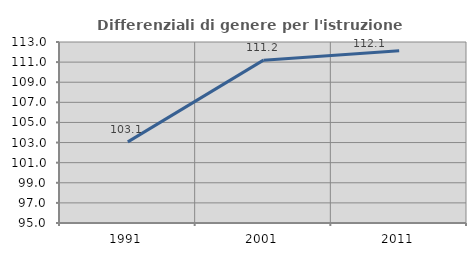
| Category | Differenziali di genere per l'istruzione superiore |
|---|---|
| 1991.0 | 103.066 |
| 2001.0 | 111.197 |
| 2011.0 | 112.118 |